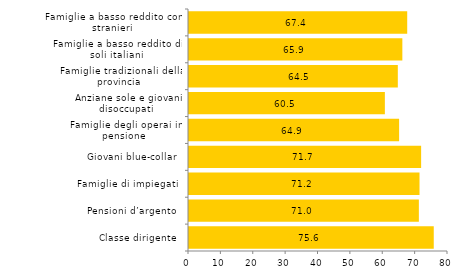
| Category | Series 0 |
|---|---|
| Classe dirigente  | 75.6 |
| Pensioni d’argento  | 71 |
| Famiglie di impiegati  | 71.2 |
| Giovani blue-collar  | 71.7 |
| Famiglie degli operai in pensione  | 64.9 |
| Anziane sole e giovani disoccupati  | 60.5 |
| Famiglie tradizionali della provincia  | 64.5 |
| Famiglie a basso reddito di soli italiani  | 65.9 |
| Famiglie a basso reddito con stranieri  | 67.4 |